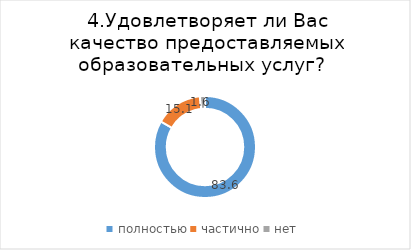
| Category | Series 0 |
|---|---|
| полностью | 83.562 |
| частично | 15.101 |
| нет | 1.599 |